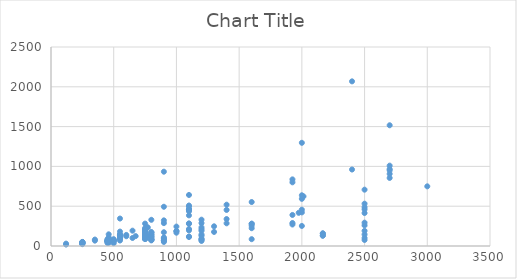
| Category | Series 0 |
|---|---|
| 120.0 | 29.9 |
| 120.0 | 18.1 |
| 250.0 | 23 |
| 250.0 | 33.5 |
| 250.0 | 35.3 |
| 250.0 | 49.12 |
| 250.0 | 47.14 |
| 250.0 | 49.38 |
| 250.0 | 51.11 |
| 250.0 | 35.3 |
| 250.0 | 33.5 |
| 250.0 | 33.5 |
| 350.0 | 67.3 |
| 350.0 | 81 |
| 450.0 | 85.12 |
| 450.0 | 64.73 |
| 450.0 | 56 |
| 450.0 | 61.71 |
| 450.0 | 38.6 |
| 450.0 | 56.6 |
| 450.0 | 65.64 |
| 450.0 | 69.59 |
| 460.0 | 79.94 |
| 460.0 | 94.16 |
| 460.0 | 83.82 |
| 460.0 | 71.61 |
| 460.0 | 85.99 |
| 460.0 | 89.84 |
| 460.0 | 106.2 |
| 460.0 | 146.8 |
| 460.0 | 42 |
| 460.0 | 46.73 |
| 460.0 | 70.84 |
| 460.0 | 60.06 |
| 495.0 | 69.1 |
| 495.0 | 75.7 |
| 500.0 | 35.42 |
| 500.0 | 56.84 |
| 500.0 | 85.85 |
| 500.0 | 69.23 |
| 500.0 | 69.36 |
| 500.0 | 70.11 |
| 550.0 | 181.1 |
| 550.0 | 68.9 |
| 550.0 | 88 |
| 550.0 | 146.4 |
| 550.0 | 111 |
| 550.0 | 135.2 |
| 550.0 | 133.8 |
| 550.0 | 125.44 |
| 550.0 | 143 |
| 550.0 | 95.69 |
| 550.0 | 136.08 |
| 550.0 | 345 |
| 600.0 | 139.3 |
| 600.0 | 122.7 |
| 650.0 | 100.7 |
| 650.0 | 192.5 |
| 675.0 | 124.3 |
| 750.0 | 148.19 |
| 750.0 | 127.46 |
| 750.0 | 127.46 |
| 750.0 | 162.3 |
| 750.0 | 130.1 |
| 750.0 | 115.1 |
| 750.0 | 202.36 |
| 750.0 | 189.4 |
| 750.0 | 115.3 |
| 750.0 | 168.5 |
| 750.0 | 93 |
| 750.0 | 155 |
| 750.0 | 94 |
| 750.0 | 102.12 |
| 750.0 | 100.04 |
| 750.0 | 93.1 |
| 750.0 | 88.32 |
| 750.0 | 138.27 |
| 750.0 | 169.2 |
| 750.0 | 100.55 |
| 750.0 | 117.54 |
| 750.0 | 281.4 |
| 750.0 | 127.6 |
| 750.0 | 87.4 |
| 750.0 | 130.8 |
| 750.0 | 93 |
| 750.0 | 102.2 |
| 750.0 | 93.4 |
| 750.0 | 130.8 |
| 750.0 | 145.4 |
| 750.0 | 144.3 |
| 750.0 | 171.6 |
| 750.0 | 134 |
| 750.0 | 125.4 |
| 750.0 | 125.4 |
| 750.0 | 144.5 |
| 750.0 | 147 |
| 750.0 | 119.16 |
| 750.0 | 147 |
| 750.0 | 201.6 |
| 750.0 | 137.1 |
| 750.0 | 173.61 |
| 750.0 | 203.58 |
| 750.0 | 186.73 |
| 750.0 | 183.75 |
| 750.0 | 175.6 |
| 750.0 | 131.57 |
| 750.0 | 168.5 |
| 750.0 | 130.1 |
| 750.0 | 115.3 |
| 750.0 | 225.16 |
| 750.0 | 92.41 |
| 750.0 | 131.57 |
| 750.0 | 115.3 |
| 750.0 | 115.3 |
| 770.0 | 124.94 |
| 770.0 | 233.01 |
| 770.0 | 232.92 |
| 800.0 | 85.37 |
| 800.0 | 90.17 |
| 800.0 | 75.97 |
| 800.0 | 80.11 |
| 800.0 | 113.47 |
| 800.0 | 70.51 |
| 800.0 | 139.8 |
| 800.0 | 329 |
| 800.0 | 174.1 |
| 800.0 | 168.59 |
| 800.0 | 135.32 |
| 800.0 | 81.43 |
| 800.0 | 169.67 |
| 800.0 | 149.62 |
| 800.0 | 118.51 |
| 800.0 | 111.05 |
| 900.0 | 67.91 |
| 900.0 | 87.39 |
| 900.0 | 50.88 |
| 900.0 | 68.1 |
| 900.0 | 933.5 |
| 900.0 | 492.97 |
| 900.0 | 287.5 |
| 900.0 | 92 |
| 900.0 | 108.22 |
| 900.0 | 172.9 |
| 900.0 | 322 |
| 1000.0 | 187.98 |
| 1000.0 | 243.9 |
| 1000.0 | 167.2 |
| 1000.0 | 187.8 |
| 1100.0 | 113.1 |
| 1100.0 | 497.2 |
| 1100.0 | 213.2 |
| 1100.0 | 641.1 |
| 1100.0 | 384.7 |
| 1100.0 | 118.7 |
| 1100.0 | 450.9 |
| 1100.0 | 465.1 |
| 1100.0 | 195.6 |
| 1100.0 | 457.3 |
| 1100.0 | 457.3 |
| 1100.0 | 457.3 |
| 1100.0 | 508.8 |
| 1100.0 | 436.9 |
| 1100.0 | 284.2 |
| 1100.0 | 278.8 |
| 1200.0 | 92.15 |
| 1200.0 | 209.34 |
| 1200.0 | 288 |
| 1200.0 | 63.38 |
| 1200.0 | 129.48 |
| 1200.0 | 74.29 |
| 1200.0 | 86.52 |
| 1200.0 | 144.43 |
| 1200.0 | 330.6 |
| 1200.0 | 234 |
| 1200.0 | 190.37 |
| 1300.0 | 247.4 |
| 1300.0 | 176.68 |
| 1400.0 | 518.9 |
| 1400.0 | 285 |
| 1400.0 | 453.05 |
| 1400.0 | 338.76 |
| 1600.0 | 552.3 |
| 1600.0 | 279 |
| 1600.0 | 85.59 |
| 1600.0 | 223.48 |
| 1600.0 | 255.52 |
| 1600.0 | 280.39 |
| 1925.0 | 270 |
| 1925.0 | 390 |
| 1925.0 | 800 |
| 1925.0 | 837 |
| 1925.0 | 288.96 |
| 1975.0 | 416.92 |
| 2000.0 | 592.4 |
| 2000.0 | 637.2 |
| 2000.0 | 422.2 |
| 2000.0 | 1296.4 |
| 2000.0 | 252 |
| 2000.0 | 455.96 |
| 2013.0 | 623.2 |
| 2167.0 | 155.42 |
| 2167.0 | 130.02 |
| 2167.0 | 130.02 |
| 2167.0 | 159.71 |
| 2400.0 | 2068.4 |
| 2400.0 | 960.82 |
| 2500.0 | 487.8 |
| 2500.0 | 190.5 |
| 2500.0 | 531.64 |
| 2500.0 | 293.16 |
| 2500.0 | 707.68 |
| 2500.0 | 460.4 |
| 2500.0 | 258.73 |
| 2500.0 | 414.3 |
| 2500.0 | 101.08 |
| 2500.0 | 75.73 |
| 2500.0 | 144.91 |
| 2700.0 | 1516.7 |
| 2700.0 | 855.2 |
| 2700.0 | 949.9 |
| 2700.0 | 1009.5 |
| 2700.0 | 966.9 |
| 2700.0 | 905.8 |
| 3000.0 | 749.5 |